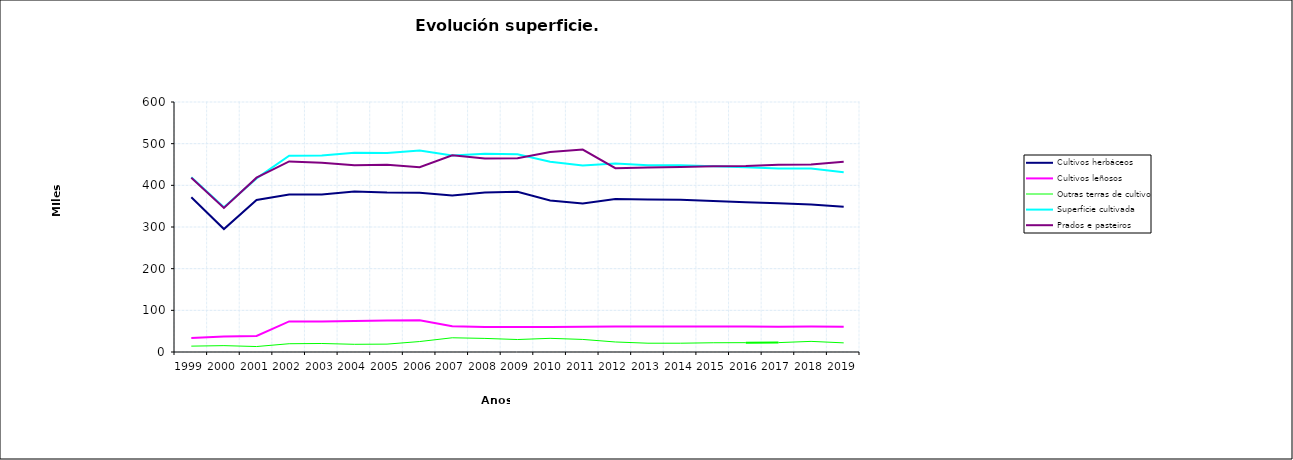
| Category | Cultivos herbáceos | Cultivos leñosos | Outras terras de cultivo | Superficie cultivada | Prados e pasteiros |
|---|---|---|---|---|---|
| 1999.0 | 371315 | 33840 | 14093 | 419248 | 418338 |
| 2000.0 | 295178 | 37200 | 15271 | 347649 | 345609 |
| 2001.0 | 365011 | 38534 | 13088 | 416633 | 418346 |
| 2002.0 | 377882 | 73349 | 19842 | 471073 | 457411 |
| 2003.0 | 378136 | 73178 | 20413 | 471727 | 454264 |
| 2004.0 | 385369 | 74294 | 18476 | 478139 | 447932 |
| 2005.0 | 382524 | 75897 | 18901 | 477322 | 449161 |
| 2006.0 | 382111 | 76316 | 25109 | 483536 | 443399 |
| 2007.0 | 375705.25 | 61616.22 | 34129.947 | 471451.417 | 472221.153 |
| 2008.0 | 382915.79 | 60049.929 | 32593.548 | 475559.267 | 464270.125 |
| 2009.0 | 384709.241 | 60030.463 | 29930.207 | 474669.911 | 464945.966 |
| 2010.0 | 363590.792 | 60164.325 | 32810.257 | 456565.374 | 479902.855 |
| 2011.0 | 356706.318 | 60571.697 | 30182.798 | 447460.813 | 485744.249 |
| 2012.0 | 367138 | 61165 | 24069 | 452372 | 441152 |
| 2013.0 | 365749.951 | 61335.678 | 21088.602 | 448174.231 | 443077.31 |
| 2014.0 | 365507.762 | 61346.461 | 21109.39 | 447963.613 | 443986.713 |
| 2015.0 | 362191 | 61336 | 22168 | 445695 | 445511 |
| 2016.0 | 359629.031 | 61076.378 | 22412.254 | 443117.662 | 446383.275 |
| 2017.0 | 356843.003 | 60876.462 | 22521.368 | 440240.833 | 449653.437 |
| 2018.0 | 353830.488 | 61087.44 | 25463.428 | 440381.355 | 450254.555 |
| 2019.0 | 348885.506 | 60572.715 | 21925.158 | 431383.378 | 456652.702 |